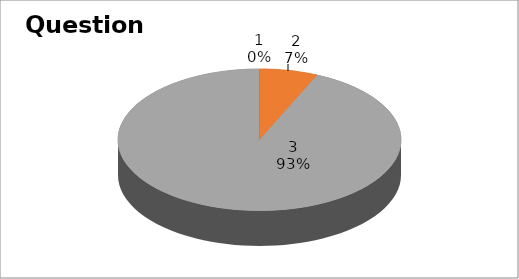
| Category | Series 0 |
|---|---|
| 0 | 0 |
| 1 | 4 |
| 2 | 56 |